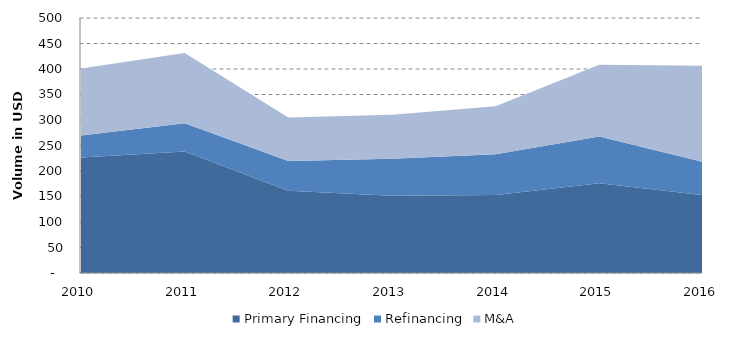
| Category | Primary Financing | Refinancing | M&A |
|---|---|---|---|
| 2010.0 | 226.471 | 43.232 | 131.469 |
| 2011.0 | 238.376 | 55.398 | 137.454 |
| 2012.0 | 161.498 | 58.244 | 85.099 |
| 2013.0 | 151.531 | 72.556 | 85.999 |
| 2014.0 | 152.897 | 79.832 | 94.232 |
| 2015.0 | 176.018 | 91.846 | 140.413 |
| 2016.0 | 152.8 | 65.06 | 188.281 |